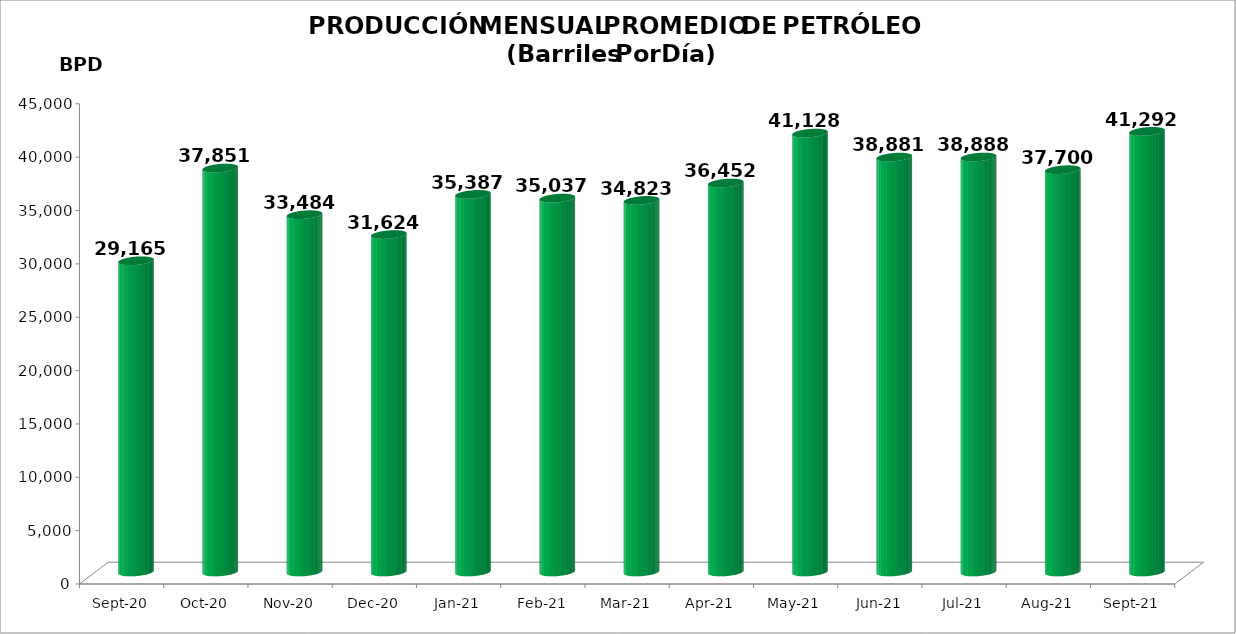
| Category | Series 0 |
|---|---|
| 2020-09-01 | 29165 |
| 2020-10-01 | 37851 |
| 2020-11-01 | 33484 |
| 2020-12-01 | 31624 |
| 2021-01-01 | 35387 |
| 2021-02-01 | 35037 |
| 2021-03-01 | 34823 |
| 2021-04-01 | 36452 |
| 2021-05-01 | 41128.032 |
| 2021-06-01 | 38881.4 |
| 2021-07-01 | 38887.645 |
| 2021-08-01 | 37699.645 |
| 2021-09-01 | 41292 |